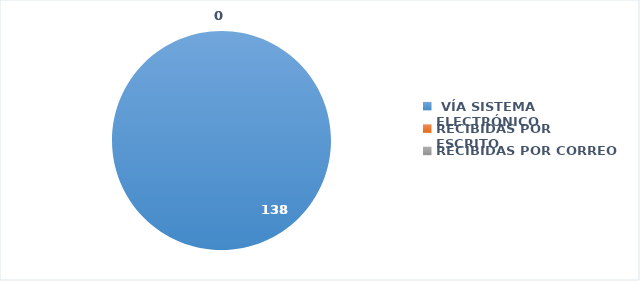
| Category | SOLICITUDES RECIBIDAS |
|---|---|
|  VÍA SISTEMA ELECTRÓNICO | 138 |
| RECIBIDAS POR ESCRITO | 0 |
| RECIBIDAS POR CORREO | 0 |